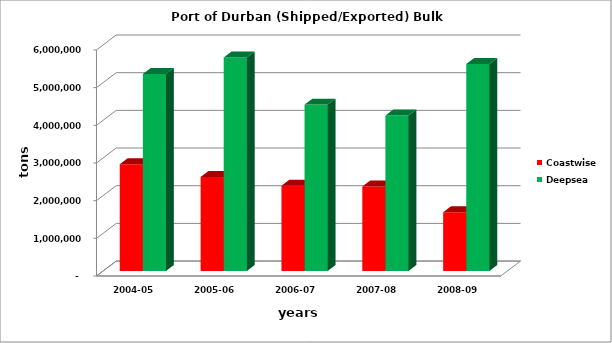
| Category | Coastwise | Deepsea |
|---|---|---|
| 2004-05 | 2833472 | 5227826 |
| 2005-06 | 2493916 | 5664141 |
| 2006-07 | 2263219 | 4415737 |
| 2007-08 | 2242143 | 4128336 |
| 2008-09 | 1559000 | 5496419 |